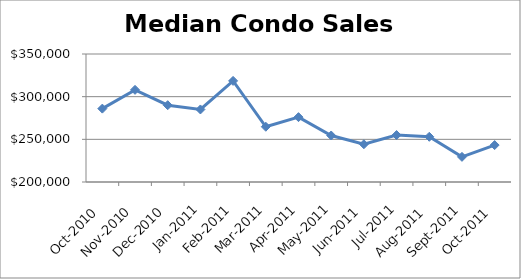
| Category | Series 0 |
|---|---|
| 2010-10-01 | 286000 |
| 2010-11-01 | 308000 |
| 2010-12-01 | 290000 |
| 2011-01-01 | 285000 |
| 2011-02-01 | 318500 |
| 2011-03-01 | 264750 |
| 2011-04-01 | 276000 |
| 2011-05-01 | 254500 |
| 2011-06-01 | 244250 |
| 2011-07-01 | 255000 |
| 2011-08-01 | 253000 |
| 2011-09-01 | 229475 |
| 2011-10-01 | 243250 |